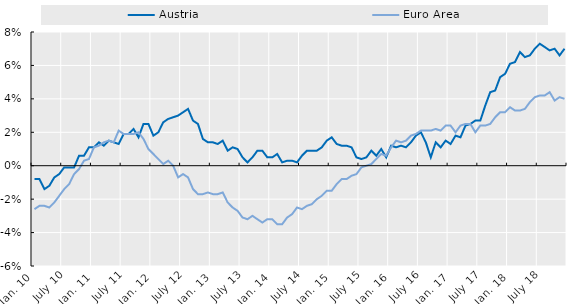
| Category | Austria | Euro Area |
|---|---|---|
| Jan. 10 | -0.008 | -0.026 |
| Feb. 10 | -0.008 | -0.024 |
| Mar. 10 | -0.014 | -0.024 |
| Apr. 10 | -0.012 | -0.025 |
| May 10 | -0.007 | -0.022 |
| June 10 | -0.005 | -0.018 |
| July 10 | -0.001 | -0.014 |
| Aug. 10 | -0.001 | -0.011 |
| Sep. 10 | -0.001 | -0.005 |
| Oct. 10 | 0.006 | -0.002 |
| Nov. 10 | 0.006 | 0.003 |
| Dec. 10 | 0.011 | 0.004 |
| Jan. 11 | 0.011 | 0.011 |
| Feb. 11 | 0.014 | 0.012 |
| Mar. 11 | 0.012 | 0.014 |
| Apr. 11 | 0.015 | 0.015 |
| May 11 | 0.014 | 0.014 |
| June 11 | 0.013 | 0.021 |
| July 11 | 0.019 | 0.019 |
| Aug. 11 | 0.019 | 0.019 |
| Sep. 11 | 0.022 | 0.019 |
| Oct. 11 | 0.017 | 0.02 |
| Nov. 11 | 0.025 | 0.016 |
| Dec. 11 | 0.025 | 0.01 |
| Jan. 12 | 0.018 | 0.007 |
| Feb. 12 | 0.02 | 0.004 |
| Mar. 12 | 0.026 | 0.001 |
| Apr. 12 | 0.028 | 0.003 |
| May 12 | 0.029 | 0 |
| June 12 | 0.03 | -0.007 |
| July 12 | 0.032 | -0.005 |
| Aug. 12 | 0.034 | -0.007 |
| Sep. 12 | 0.027 | -0.014 |
| Oct. 12 | 0.025 | -0.017 |
| Nov. 12 | 0.016 | -0.017 |
| Dec. 12 | 0.014 | -0.016 |
| Jan. 13 | 0.014 | -0.017 |
| Feb. 13 | 0.013 | -0.017 |
| Mar. 13 | 0.015 | -0.016 |
| Apr. 13 | 0.009 | -0.022 |
| May 13 | 0.011 | -0.025 |
| June 13 | 0.01 | -0.027 |
| July 13 | 0.005 | -0.031 |
| Aug. 13 | 0.002 | -0.032 |
| Sep. 13 | 0.005 | -0.03 |
| Oct. 13 | 0.009 | -0.032 |
| Nov. 13 | 0.009 | -0.034 |
| Dec. 13 | 0.005 | -0.032 |
| Jan. 14 | 0.005 | -0.032 |
| Feb. 14 | 0.007 | -0.035 |
| Mar. 14 | 0.002 | -0.035 |
| Apr. 14 | 0.003 | -0.031 |
| May 14 | 0.003 | -0.029 |
| June 14 | 0.002 | -0.025 |
| July 14 | 0.006 | -0.026 |
| Aug. 14 | 0.009 | -0.024 |
| Sep. 14 | 0.009 | -0.023 |
| Oct. 14 | 0.009 | -0.02 |
| Nov. 14 | 0.011 | -0.018 |
| Dec. 14 | 0.015 | -0.015 |
| Jan. 15 | 0.017 | -0.015 |
| Feb. 15 | 0.013 | -0.011 |
| Mar. 15 | 0.012 | -0.008 |
| Apr. 15 | 0.012 | -0.008 |
| May 15 | 0.011 | -0.006 |
| June 15 | 0.005 | -0.005 |
| July 15 | 0.004 | -0.001 |
| Aug. 15 | 0.005 | 0 |
| Sep. 15 | 0.009 | 0.001 |
| Oct. 15 | 0.006 | 0.004 |
| Nov. 15 | 0.01 | 0.007 |
| Dec. 15 | 0.005 | 0.006 |
| Jan. 16 | 0.012 | 0.011 |
| Feb. 16 | 0.011 | 0.015 |
| Mar. 16 | 0.012 | 0.014 |
| Apr. 16 | 0.011 | 0.015 |
| May 16 | 0.014 | 0.018 |
| June 16 | 0.018 | 0.019 |
| July 16 | 0.02 | 0.021 |
| Aug. 16 | 0.014 | 0.021 |
| Sep. 16 | 0.005 | 0.021 |
| Oct. 16 | 0.014 | 0.022 |
| Nov. 16 | 0.011 | 0.021 |
| Dec. 16 | 0.015 | 0.024 |
| Jan. 17 | 0.013 | 0.024 |
| Feb. 17 | 0.018 | 0.02 |
| Mar. 17 | 0.017 | 0.024 |
| Apr. 17 | 0.024 | 0.025 |
| May 17 | 0.025 | 0.025 |
| June 17 | 0.027 | 0.02 |
| July 17 | 0.027 | 0.024 |
| Aug. 17 | 0.036 | 0.024 |
| Sep. 17 | 0.044 | 0.025 |
| Oct. 17 | 0.045 | 0.029 |
| Nov. 17 | 0.053 | 0.032 |
| Dec. 17 | 0.055 | 0.032 |
| Jan. 18 | 0.061 | 0.035 |
| Feb. 18 | 0.062 | 0.033 |
| Mar. 18 | 0.068 | 0.033 |
| Apr. 18 | 0.065 | 0.034 |
| May 18 | 0.066 | 0.038 |
| June 18 | 0.07 | 0.041 |
| July 18 | 0.073 | 0.042 |
| Aug. 18 | 0.071 | 0.042 |
| Sep. 18 | 0.069 | 0.044 |
| Oct. 18 | 0.07 | 0.039 |
| Nov. 18 | 0.066 | 0.041 |
| Dec. 18 | 0.07 | 0.04 |